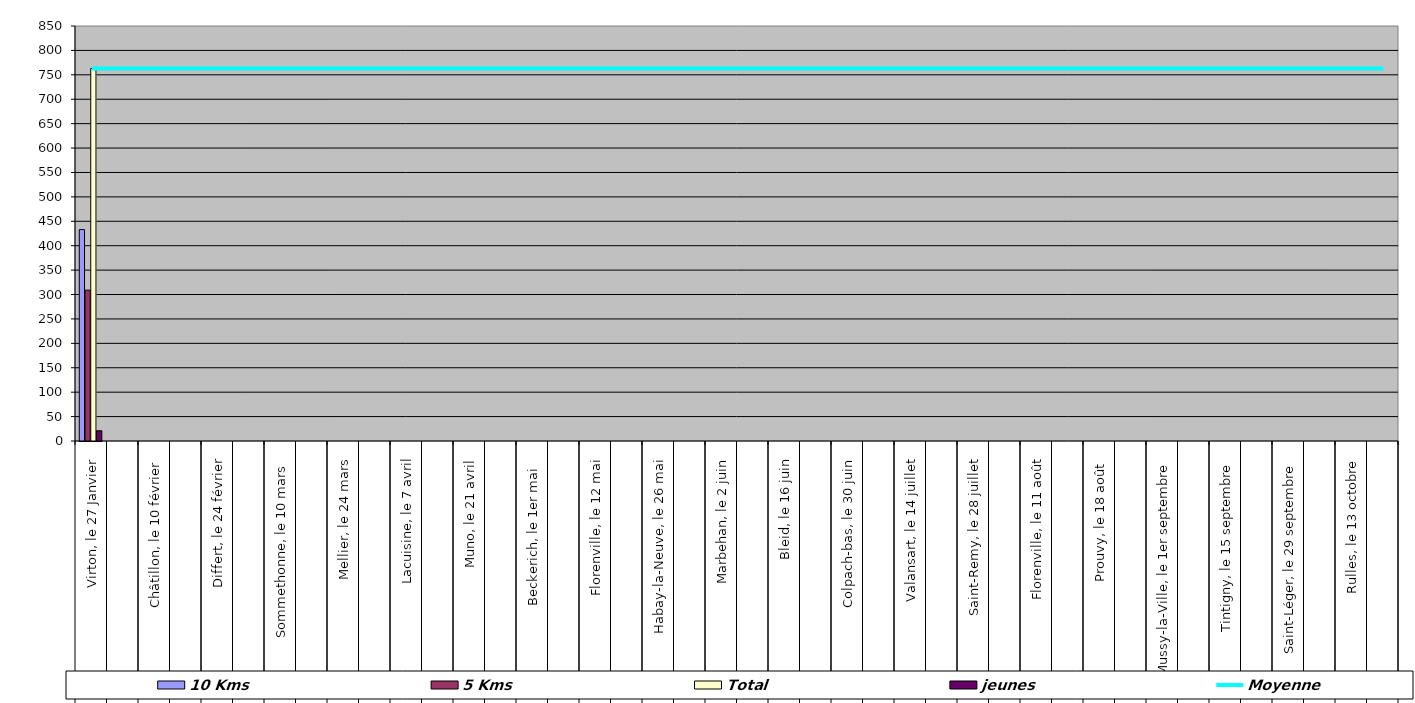
| Category | 10 Kms | 5 Kms | Total | jeunes |
|---|---|---|---|---|
| 0 | 433 | 309 | 763 | 21 |
| 1 | 0 | 0 | 0 | 0 |
| 2 | 0 | 0 | 0 | 0 |
| 3 | 0 | 0 | 0 | 0 |
| 4 | 0 | 0 | 0 | 0 |
| 5 | 0 | 0 | 0 | 0 |
| 6 | 0 | 0 | 0 | 0 |
| 7 | 0 | 0 | 0 | 0 |
| 8 | 0 | 0 | 0 | 0 |
| 9 | 0 | 0 | 0 | 0 |
| 10 | 0 | 0 | 0 | 0 |
| 11 | 0 | 0 | 0 | 0 |
| 12 | 0 | 0 | 0 | 0 |
| 13 | 0 | 0 | 0 | 0 |
| 14 | 0 | 0 | 0 | 0 |
| 15 | 0 | 0 | 0 | 0 |
| 16 | 0 | 0 | 0 | 0 |
| 17 | 0 | 0 | 0 | 0 |
| 18 | 0 | 0 | 0 | 0 |
| 19 | 0 | 0 | 0 | 0 |
| 20 | 0 | 0 | 0 | 0 |
| 21 | 0 | 0 | 0 | 0 |
| 22 | 0 | 0 | 0 | 0 |
| 23 | 0 | 0 | 0 | 0 |
| 24 | 0 | 0 | 0 | 0 |
| 25 | 0 | 0 | 0 | 0 |
| 26 | 0 | 0 | 0 | 0 |
| 27 | 0 | 0 | 0 | 0 |
| 28 | 0 | 0 | 0 | 0 |
| 29 | 0 | 0 | 0 | 0 |
| 30 | 0 | 0 | 0 | 0 |
| 31 | 0 | 0 | 0 | 0 |
| 32 | 0 | 0 | 0 | 0 |
| 33 | 0 | 0 | 0 | 0 |
| 34 | 0 | 0 | 0 | 0 |
| 35 | 0 | 0 | 0 | 0 |
| 36 | 0 | 0 | 0 | 0 |
| 37 | 0 | 0 | 0 | 0 |
| 38 | 0 | 0 | 0 | 0 |
| 39 | 0 | 0 | 0 | 0 |
| 40 | 0 | 0 | 0 | 0 |
| 41 | 0 | 0 | 0 | 0 |